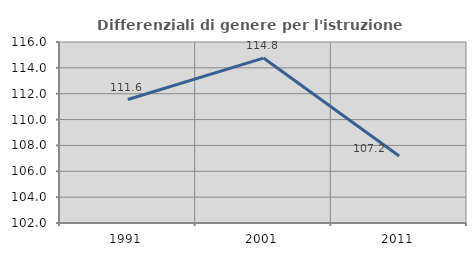
| Category | Differenziali di genere per l'istruzione superiore |
|---|---|
| 1991.0 | 111.551 |
| 2001.0 | 114.756 |
| 2011.0 | 107.186 |